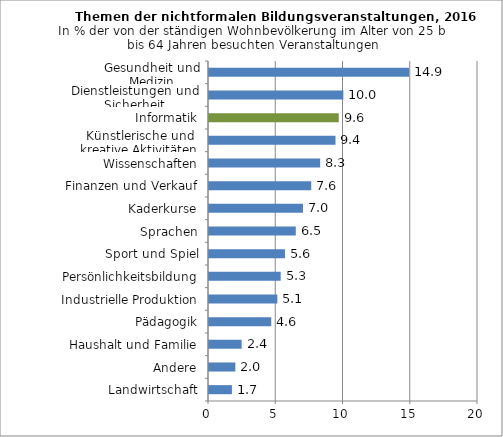
| Category | 2016 |
|---|---|
| Landwirtschaft | 1.704 |
| Andere | 1.958 |
| Haushalt und Familie | 2.426 |
| Pädagogik | 4.627 |
| Industrielle Produktion | 5.081 |
| Persönlichkeitsbildung | 5.33 |
| Sport und Spiel | 5.648 |
| Sprachen | 6.452 |
| Kaderkurse | 6.987 |
| Finanzen und Verkauf | 7.601 |
| Wissenschaften | 8.266 |
| Künstlerische und kreative Aktivitäten | 9.405 |
| Informatik | 9.648 |
| Dienstleistungen und Sicherheit | 9.989 |
| Gesundheit und Medizin | 14.876 |